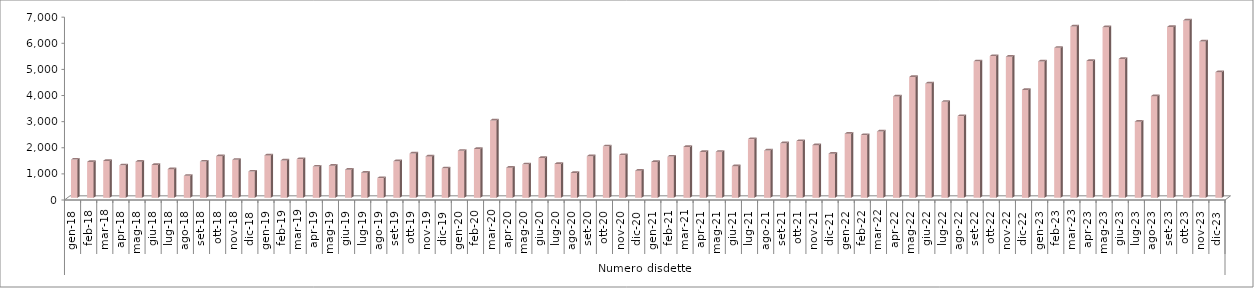
| Category | Series 0 |
|---|---|
| 0 | 1463 |
| 1900-01-01 | 1374 |
| 1900-01-02 | 1415 |
| 1900-01-03 | 1245 |
| 1900-01-04 | 1382 |
| 1900-01-05 | 1258 |
| 1900-01-06 | 1099 |
| 1900-01-07 | 843 |
| 1900-01-08 | 1388 |
| 1900-01-09 | 1594 |
| 1900-01-10 | 1454 |
| 1900-01-11 | 1005 |
| 1900-01-12 | 1625 |
| 1900-01-13 | 1430 |
| 1900-01-14 | 1484 |
| 1900-01-15 | 1196 |
| 1900-01-16 | 1232 |
| 1900-01-17 | 1076 |
| 1900-01-18 | 963 |
| 1900-01-19 | 755 |
| 1900-01-20 | 1400 |
| 1900-01-21 | 1697 |
| 1900-01-22 | 1587 |
| 1900-01-23 | 1131 |
| 1900-01-24 | 1801 |
| 1900-01-25 | 1874 |
| 1900-01-26 | 2963 |
| 1900-01-27 | 1154 |
| 1900-01-28 | 1282 |
| 1900-01-29 | 1525 |
| 1900-01-30 | 1297 |
| 1900-01-31 | 955 |
| 1900-02-01 | 1592 |
| 1900-02-02 | 1971 |
| 1900-02-03 | 1637 |
| 1900-02-04 | 1038 |
| 1900-02-05 | 1373 |
| 1900-02-06 | 1579 |
| 1900-02-07 | 1951 |
| 1900-02-08 | 1754 |
| 1900-02-09 | 1762 |
| 1900-02-10 | 1212 |
| 1900-02-11 | 2248 |
| 1900-02-12 | 1811 |
| 1900-02-13 | 2089 |
| 1900-02-14 | 2173 |
| 1900-02-15 | 2017 |
| 1900-02-16 | 1690 |
| 1900-02-17 | 2455 |
| 1900-02-18 | 2403 |
| 1900-02-19 | 2539 |
| 1900-02-20 | 3881 |
| 1900-02-21 | 4626 |
| 1900-02-22 | 4376 |
| 1900-02-23 | 3675 |
| 1900-02-24 | 3129 |
| 1900-02-25 | 5225 |
| 1900-02-26 | 5426 |
| 1900-02-27 | 5403 |
| 1900-02-28 | 4132 |
| 1900-02-28 | 5222 |
| 1900-03-01 | 5742 |
| 1900-03-02 | 6560 |
| 1900-03-03 | 5242 |
| 1900-03-04 | 6534 |
| 1900-03-05 | 5320 |
| 1900-03-06 | 2917 |
| 1900-03-07 | 3894 |
| 1900-03-08 | 6540 |
| 1900-03-09 | 6792 |
| 1900-03-10 | 5985 |
| 1900-03-11 | 4809 |